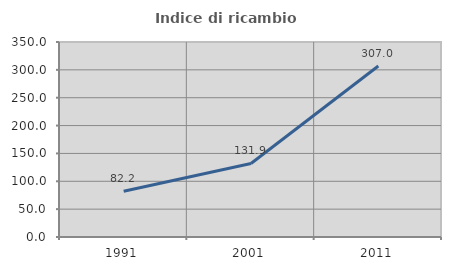
| Category | Indice di ricambio occupazionale  |
|---|---|
| 1991.0 | 82.173 |
| 2001.0 | 131.93 |
| 2011.0 | 307.009 |